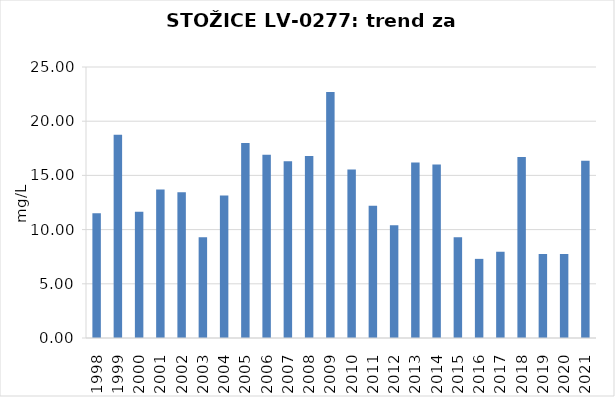
| Category | Vsota |
|---|---|
| 1998 | 11.5 |
| 1999 | 18.75 |
| 2000 | 11.65 |
| 2001 | 13.7 |
| 2002 | 13.45 |
| 2003 | 9.3 |
| 2004 | 13.15 |
| 2005 | 18 |
| 2006 | 16.9 |
| 2007 | 16.3 |
| 2008 | 16.8 |
| 2009 | 22.7 |
| 2010 | 15.55 |
| 2011 | 12.2 |
| 2012 | 10.4 |
| 2013 | 16.2 |
| 2014 | 16 |
| 2015 | 9.3 |
| 2016 | 7.3 |
| 2017 | 7.95 |
| 2018 | 16.7 |
| 2019 | 7.75 |
| 2020 | 7.75 |
| 2021 | 16.35 |